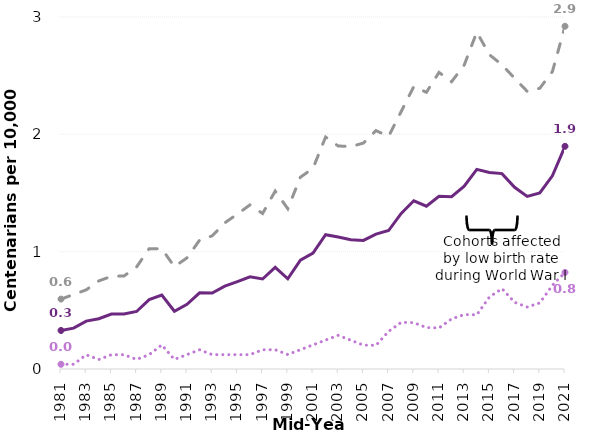
| Category | Persons | Females | Males |
|---|---|---|---|
| 1981.0 | 0.328 | 0.596 | 0.04 |
| 1982.0 | 0.349 | 0.635 | 0.04 |
| 1983.0 | 0.408 | 0.674 | 0.121 |
| 1984.0 | 0.428 | 0.751 | 0.081 |
| 1985.0 | 0.468 | 0.79 | 0.121 |
| 1986.0 | 0.47 | 0.793 | 0.122 |
| 1987.0 | 0.49 | 0.87 | 0.081 |
| 1988.0 | 0.591 | 1.025 | 0.123 |
| 1989.0 | 0.63 | 1.025 | 0.205 |
| 1990.0 | 0.492 | 0.872 | 0.082 |
| 1991.0 | 0.551 | 0.947 | 0.123 |
| 1992.0 | 0.649 | 1.098 | 0.164 |
| 1993.0 | 0.648 | 1.135 | 0.123 |
| 1994.0 | 0.706 | 1.246 | 0.122 |
| 1995.0 | 0.745 | 1.321 | 0.122 |
| 1996.0 | 0.786 | 1.399 | 0.123 |
| 1997.0 | 0.767 | 1.325 | 0.164 |
| 1998.0 | 0.867 | 1.516 | 0.164 |
| 1999.0 | 0.769 | 1.366 | 0.123 |
| 2000.0 | 0.928 | 1.634 | 0.164 |
| 2001.0 | 0.987 | 1.711 | 0.205 |
| 2002.0 | 1.145 | 1.977 | 0.246 |
| 2003.0 | 1.125 | 1.901 | 0.287 |
| 2004.0 | 1.101 | 1.896 | 0.245 |
| 2005.0 | 1.096 | 1.925 | 0.203 |
| 2006.0 | 1.149 | 2.032 | 0.202 |
| 2007.0 | 1.18 | 1.982 | 0.32 |
| 2008.0 | 1.326 | 2.195 | 0.398 |
| 2009.0 | 1.434 | 2.407 | 0.395 |
| 2010.0 | 1.387 | 2.358 | 0.353 |
| 2011.0 | 1.472 | 2.528 | 0.35 |
| 2012.0 | 1.468 | 2.449 | 0.427 |
| 2013.0 | 1.558 | 2.59 | 0.464 |
| 2014.0 | 1.702 | 2.872 | 0.462 |
| 2015.0 | 1.675 | 2.679 | 0.613 |
| 2016.0 | 1.665 | 2.593 | 0.685 |
| 2017.0 | 1.548 | 2.478 | 0.568 |
| 2018.0 | 1.471 | 2.366 | 0.529 |
| 2019.0 | 1.501 | 2.393 | 0.563 |
| 2020.0 | 1.647 | 2.535 | 0.713 |
| 2021.0 | 1.898 | 2.921 | 0.823 |